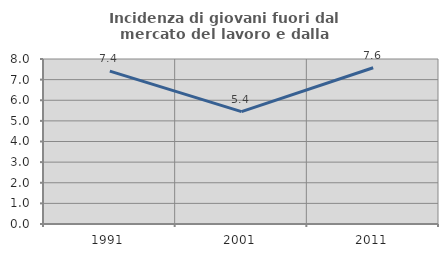
| Category | Incidenza di giovani fuori dal mercato del lavoro e dalla formazione  |
|---|---|
| 1991.0 | 7.413 |
| 2001.0 | 5.447 |
| 2011.0 | 7.574 |